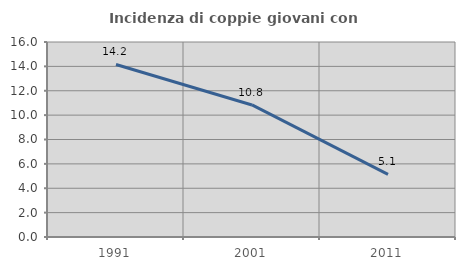
| Category | Incidenza di coppie giovani con figli |
|---|---|
| 1991.0 | 14.157 |
| 2001.0 | 10.836 |
| 2011.0 | 5.145 |